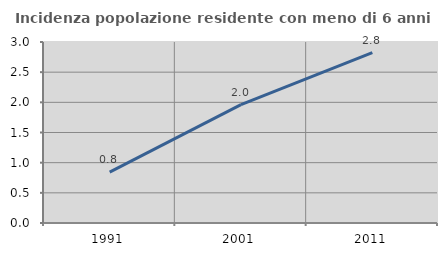
| Category | Incidenza popolazione residente con meno di 6 anni |
|---|---|
| 1991.0 | 0.844 |
| 2001.0 | 1.961 |
| 2011.0 | 2.825 |